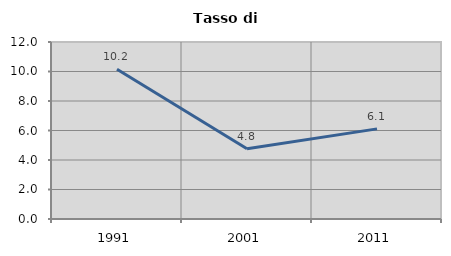
| Category | Tasso di disoccupazione   |
|---|---|
| 1991.0 | 10.151 |
| 2001.0 | 4.757 |
| 2011.0 | 6.11 |